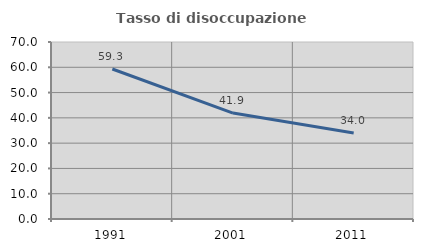
| Category | Tasso di disoccupazione giovanile  |
|---|---|
| 1991.0 | 59.322 |
| 2001.0 | 41.88 |
| 2011.0 | 33.99 |